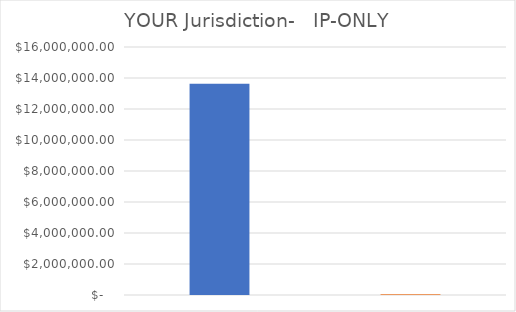
| Category | YOUR Jurisdiction-   IP-ONLY |
|---|---|
| 0 | 13625649 |
| 1 | 46416 |